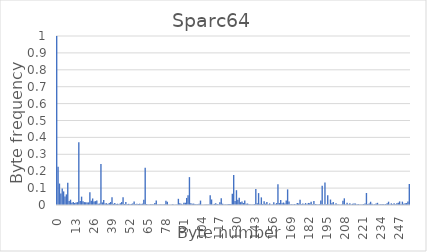
| Category | Series 0 |
|---|---|
| 0.0 | 1 |
| 1.0 | 0.226 |
| 2.0 | 0.127 |
| 3.0 | 0.068 |
| 4.0 | 0.097 |
| 5.0 | 0.08 |
| 6.0 | 0.051 |
| 7.0 | 0.063 |
| 8.0 | 0.131 |
| 9.0 | 0.024 |
| 10.0 | 0.031 |
| 11.0 | 0.013 |
| 12.0 | 0.017 |
| 13.0 | 0.012 |
| 14.0 | 0.014 |
| 15.0 | 0.017 |
| 16.0 | 0.372 |
| 17.0 | 0.024 |
| 18.0 | 0.049 |
| 19.0 | 0.022 |
| 20.0 | 0.017 |
| 21.0 | 0.016 |
| 22.0 | 0.015 |
| 23.0 | 0.016 |
| 24.0 | 0.075 |
| 25.0 | 0.024 |
| 26.0 | 0.039 |
| 27.0 | 0.021 |
| 28.0 | 0.023 |
| 29.0 | 0.027 |
| 30.0 | 0.007 |
| 31.0 | 0.009 |
| 32.0 | 0.242 |
| 33.0 | 0.015 |
| 34.0 | 0.03 |
| 35.0 | 0.009 |
| 36.0 | 0.011 |
| 37.0 | 0.007 |
| 38.0 | 0.012 |
| 39.0 | 0.018 |
| 40.0 | 0.046 |
| 41.0 | 0.007 |
| 42.0 | 0.012 |
| 43.0 | 0.006 |
| 44.0 | 0.008 |
| 45.0 | 0.005 |
| 46.0 | 0.01 |
| 47.0 | 0.017 |
| 48.0 | 0.045 |
| 49.0 | 0.006 |
| 50.0 | 0.017 |
| 51.0 | 0.005 |
| 52.0 | 0.007 |
| 53.0 | 0.005 |
| 54.0 | 0.006 |
| 55.0 | 0.01 |
| 56.0 | 0.02 |
| 57.0 | 0.005 |
| 58.0 | 0.007 |
| 59.0 | 0.006 |
| 60.0 | 0.008 |
| 61.0 | 0.006 |
| 62.0 | 0.008 |
| 63.0 | 0.03 |
| 64.0 | 0.22 |
| 65.0 | 0.005 |
| 66.0 | 0.003 |
| 67.0 | 0.003 |
| 68.0 | 0.004 |
| 69.0 | 0.004 |
| 70.0 | 0.003 |
| 71.0 | 0.012 |
| 72.0 | 0.026 |
| 73.0 | 0.003 |
| 74.0 | 0.003 |
| 75.0 | 0.003 |
| 76.0 | 0.004 |
| 77.0 | 0.002 |
| 78.0 | 0.004 |
| 79.0 | 0.024 |
| 80.0 | 0.019 |
| 81.0 | 0.002 |
| 82.0 | 0.002 |
| 83.0 | 0.002 |
| 84.0 | 0.004 |
| 85.0 | 0.002 |
| 86.0 | 0.002 |
| 87.0 | 0.003 |
| 88.0 | 0.037 |
| 89.0 | 0.01 |
| 90.0 | 0.008 |
| 91.0 | 0.003 |
| 92.0 | 0.013 |
| 93.0 | 0.013 |
| 94.0 | 0.042 |
| 95.0 | 0.058 |
| 96.0 | 0.165 |
| 97.0 | 0.01 |
| 98.0 | 0.008 |
| 99.0 | 0.008 |
| 100.0 | 0.006 |
| 101.0 | 0.004 |
| 102.0 | 0.004 |
| 103.0 | 0.008 |
| 104.0 | 0.026 |
| 105.0 | 0.002 |
| 106.0 | 0.002 |
| 107.0 | 0.002 |
| 108.0 | 0.003 |
| 109.0 | 0.002 |
| 110.0 | 0.002 |
| 111.0 | 0.057 |
| 112.0 | 0.033 |
| 113.0 | 0.003 |
| 114.0 | 0.007 |
| 115.0 | 0.011 |
| 116.0 | 0.006 |
| 117.0 | 0.003 |
| 118.0 | 0.016 |
| 119.0 | 0.04 |
| 120.0 | 0.008 |
| 121.0 | 0.002 |
| 122.0 | 0.003 |
| 123.0 | 0.003 |
| 124.0 | 0.006 |
| 125.0 | 0.005 |
| 126.0 | 0.006 |
| 127.0 | 0.066 |
| 128.0 | 0.177 |
| 129.0 | 0.024 |
| 130.0 | 0.088 |
| 131.0 | 0.03 |
| 132.0 | 0.043 |
| 133.0 | 0.017 |
| 134.0 | 0.021 |
| 135.0 | 0.012 |
| 136.0 | 0.027 |
| 137.0 | 0.007 |
| 138.0 | 0.009 |
| 139.0 | 0.005 |
| 140.0 | 0.004 |
| 141.0 | 0.002 |
| 142.0 | 0.003 |
| 143.0 | 0.005 |
| 144.0 | 0.095 |
| 145.0 | 0.011 |
| 146.0 | 0.07 |
| 147.0 | 0.008 |
| 148.0 | 0.045 |
| 149.0 | 0.005 |
| 150.0 | 0.022 |
| 151.0 | 0.008 |
| 152.0 | 0.017 |
| 153.0 | 0.003 |
| 154.0 | 0.01 |
| 155.0 | 0.003 |
| 156.0 | 0.003 |
| 157.0 | 0.016 |
| 158.0 | 0.005 |
| 159.0 | 0.011 |
| 160.0 | 0.123 |
| 161.0 | 0.011 |
| 162.0 | 0.03 |
| 163.0 | 0.011 |
| 164.0 | 0.015 |
| 165.0 | 0.009 |
| 166.0 | 0.026 |
| 167.0 | 0.092 |
| 168.0 | 0.021 |
| 169.0 | 0.003 |
| 170.0 | 0.005 |
| 171.0 | 0.002 |
| 172.0 | 0.005 |
| 173.0 | 0.002 |
| 174.0 | 0.011 |
| 175.0 | 0.009 |
| 176.0 | 0.031 |
| 177.0 | 0.005 |
| 178.0 | 0.009 |
| 179.0 | 0.004 |
| 180.0 | 0.011 |
| 181.0 | 0.004 |
| 182.0 | 0.012 |
| 183.0 | 0.01 |
| 184.0 | 0.019 |
| 185.0 | 0.005 |
| 186.0 | 0.024 |
| 187.0 | 0.006 |
| 188.0 | 0.004 |
| 189.0 | 0.003 |
| 190.0 | 0.004 |
| 191.0 | 0.027 |
| 192.0 | 0.114 |
| 193.0 | 0.003 |
| 194.0 | 0.134 |
| 195.0 | 0.004 |
| 196.0 | 0.058 |
| 197.0 | 0.003 |
| 198.0 | 0.032 |
| 199.0 | 0.01 |
| 200.0 | 0.018 |
| 201.0 | 0.002 |
| 202.0 | 0.01 |
| 203.0 | 0.003 |
| 204.0 | 0.004 |
| 205.0 | 0.002 |
| 206.0 | 0.003 |
| 207.0 | 0.024 |
| 208.0 | 0.04 |
| 209.0 | 0.003 |
| 210.0 | 0.014 |
| 211.0 | 0.003 |
| 212.0 | 0.011 |
| 213.0 | 0.002 |
| 214.0 | 0.007 |
| 215.0 | 0.008 |
| 216.0 | 0.009 |
| 217.0 | 0.002 |
| 218.0 | 0.005 |
| 219.0 | 0.003 |
| 220.0 | 0.003 |
| 221.0 | 0.003 |
| 222.0 | 0.005 |
| 223.0 | 0.008 |
| 224.0 | 0.071 |
| 225.0 | 0.005 |
| 226.0 | 0.008 |
| 227.0 | 0.019 |
| 228.0 | 0.007 |
| 229.0 | 0.003 |
| 230.0 | 0.005 |
| 231.0 | 0.009 |
| 232.0 | 0.013 |
| 233.0 | 0.003 |
| 234.0 | 0.005 |
| 235.0 | 0.004 |
| 236.0 | 0.006 |
| 237.0 | 0.003 |
| 238.0 | 0.005 |
| 239.0 | 0.011 |
| 240.0 | 0.02 |
| 241.0 | 0.003 |
| 242.0 | 0.01 |
| 243.0 | 0.005 |
| 244.0 | 0.01 |
| 245.0 | 0.004 |
| 246.0 | 0.011 |
| 247.0 | 0.014 |
| 248.0 | 0.021 |
| 249.0 | 0.005 |
| 250.0 | 0.02 |
| 251.0 | 0.007 |
| 252.0 | 0.01 |
| 253.0 | 0.011 |
| 254.0 | 0.02 |
| 255.0 | 0.124 |